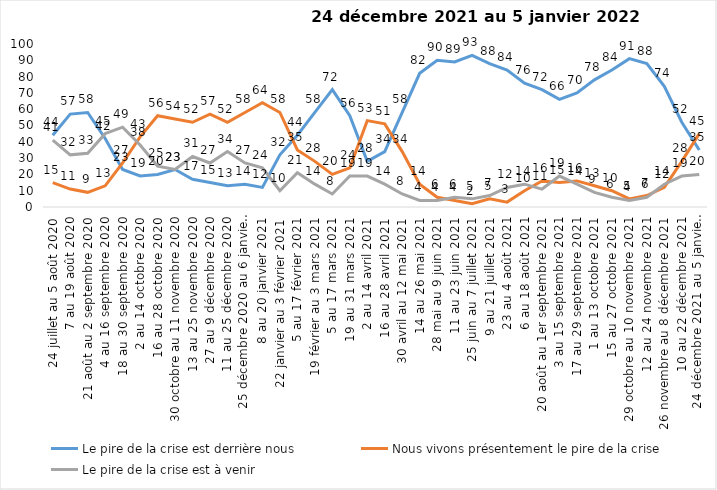
| Category | Le pire de la crise est derrière nous | Nous vivons présentement le pire de la crise | Le pire de la crise est à venir |
|---|---|---|---|
| 24 juillet au 5 août 2020 | 44 | 15 | 41 |
| 7 au 19 août 2020 | 57 | 11 | 32 |
| 21 août au 2 septembre 2020 | 58 | 9 | 33 |
| 4 au 16 septembre 2020 | 42 | 13 | 45 |
| 18 au 30 septembre 2020 | 23 | 27 | 49 |
| 2 au 14 octobre 2020 | 19 | 43 | 38 |
| 16 au 28 octobre 2020 | 20 | 56 | 25 |
| 30 octobre au 11 novembre 2020 | 23 | 54 | 23 |
| 13 au 25 novembre 2020 | 17 | 52 | 31 |
| 27 au 9 décembre 2020 | 15 | 57 | 27 |
| 11 au 25 décembre 2020 | 13 | 52 | 34 |
| 25 décembre 2020 au 6 janvier 2021 | 14 | 58 | 27 |
| 8 au 20 janvier 2021 | 12 | 64 | 24 |
| 22 janvier au 3 février 2021 | 32 | 58 | 10 |
| 5 au 17 février 2021 | 44 | 35 | 21 |
| 19 février au 3 mars 2021 | 58 | 28 | 14 |
| 5 au 17 mars 2021 | 72 | 20 | 8 |
| 19 au 31 mars 2021 | 56 | 24 | 19 |
| 2 au 14 avril 2021 | 28 | 53 | 19 |
| 16 au 28 avril 2021 | 34 | 51 | 14 |
| 30 avril au 12 mai 2021 | 58 | 34 | 8 |
| 14 au 26 mai 2021 | 82 | 14 | 4 |
| 28 mai au 9 juin 2021 | 90 | 6 | 4 |
| 11 au 23 juin 2021 | 89 | 4 | 6 |
| 25 juin au 7 juillet 2021 | 93 | 2 | 5 |
| 9 au 21 juillet 2021 | 88 | 5 | 7 |
| 23 au 4 août 2021 | 84 | 3 | 12 |
| 6 au 18 août 2021 | 76 | 10 | 14 |
| 20 août au 1er septembre 2021 | 72 | 16 | 11 |
| 3 au 15 septembre 2021 | 66 | 15 | 19 |
| 17 au 29 septembre 2021 | 70 | 16 | 14 |
| 1 au 13 octobre 2021 | 78 | 13 | 9 |
| 15 au 27 octobre 2021 | 84 | 10 | 6 |
| 29 octobre au 10 novembre 2021 | 91 | 5 | 4 |
| 12 au 24 novembre 2021 | 88 | 7 | 6 |
| 26 novembre au 8 décembre 2021 | 74 | 12 | 14 |
| 10 au 22 décembre 2021 | 52 | 28 | 19 |
| 24 décembre 2021 au 5 janvier 2022 2022 | 35 | 45 | 20 |